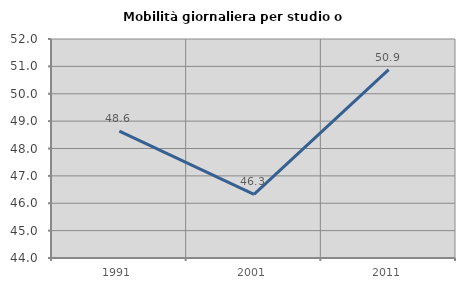
| Category | Mobilità giornaliera per studio o lavoro |
|---|---|
| 1991.0 | 48.632 |
| 2001.0 | 46.322 |
| 2011.0 | 50.879 |